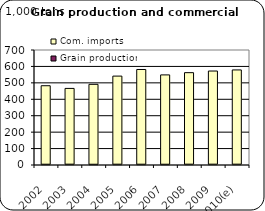
| Category | Grain production | Com. imports |
|---|---|---|
| 2002 | 1.752 | 480.759 |
| 2003 | 2.038 | 464.097 |
| 2004 | 1.598 | 489.355 |
| 2005 | 1.928 | 539.181 |
| 2006 | 1.895 | 579.426 |
| 2007 | 1.675 | 546.756 |
| 2008 | 2 | 560 |
| 2009 | 2 | 570 |
| 2010(e) | 2 | 576.653 |